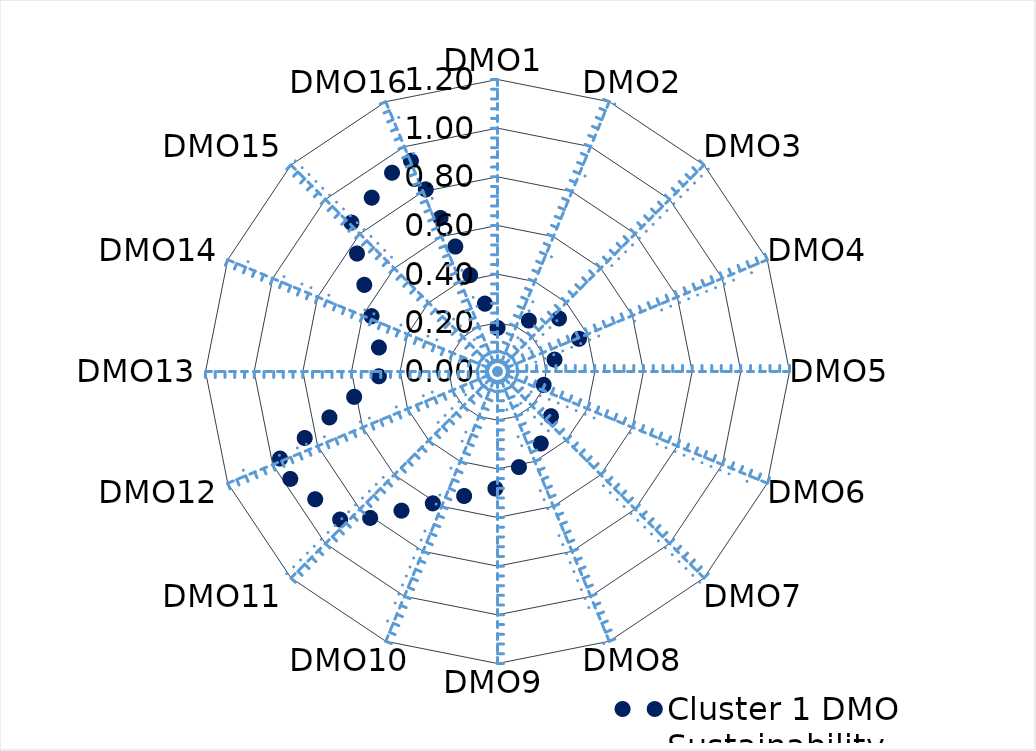
| Category | Cluster 1 DMO Sustainability  |
|---|---|
| DMO1 | 0.179 |
| DMO2 | 0.215 |
| DMO3 | 0.33 |
| DMO4 | 0.374 |
| DMO5 | 0.177 |
| DMO6 | 0.212 |
| DMO7 | 0.326 |
| DMO8 | 0.369 |
| DMO9 | 0.479 |
| DMO10 | 0.575 |
| DMO11 | 0.885 |
| DMO12 | 1 |
| DMO13 | 0.464 |
| DMO14 | 0.557 |
| DMO15 | 0.856 |
| DMO16 | 0.968 |